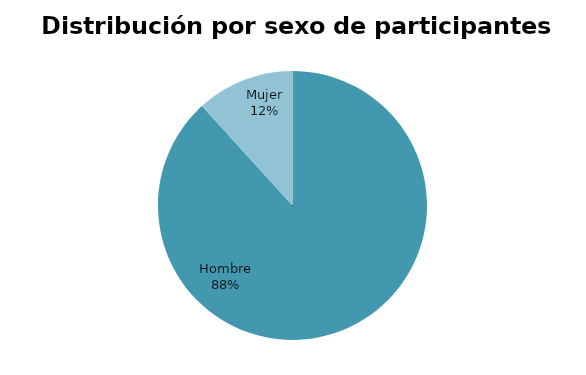
| Category | Series 0 |
|---|---|
| Hombre | 15 |
| Mujer | 2 |